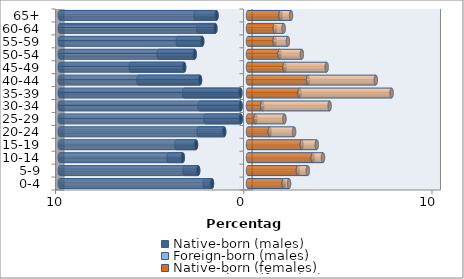
| Category | Native-born (males) | Foreign-born (males) | Native-born (females) | Foreign-born (females) |
|---|---|---|---|---|
| 0-4 | -1.914 | -0.384 | 1.894 | 0.288 |
| 5-9 | -2.65 | -0.72 | 2.65 | 0.527 |
| 10-14 | -3.467 | -0.756 | 3.441 | 0.546 |
| 15-19 | -2.761 | -1.042 | 2.858 | 0.795 |
| 20-24 | -1.266 | -1.359 | 1.155 | 1.296 |
| 25-29 | -0.386 | -1.872 | 0.401 | 1.536 |
| 30-34 | -0.395 | -2.176 | 0.759 | 3.578 |
| 35-39 | -0.407 | -2.986 | 2.742 | 4.887 |
| 40-44 | -2.549 | -3.273 | 3.19 | 3.6 |
| 45-49 | -3.394 | -2.843 | 1.95 | 2.23 |
| 50-54 | -2.833 | -1.907 | 1.68 | 1.181 |
| 55-59 | -2.432 | -1.303 | 1.415 | 0.706 |
| 60-64 | -1.732 | -0.921 | 1.424 | 0.472 |
| 65+ | -1.673 | -1.11 | 1.731 | 0.557 |